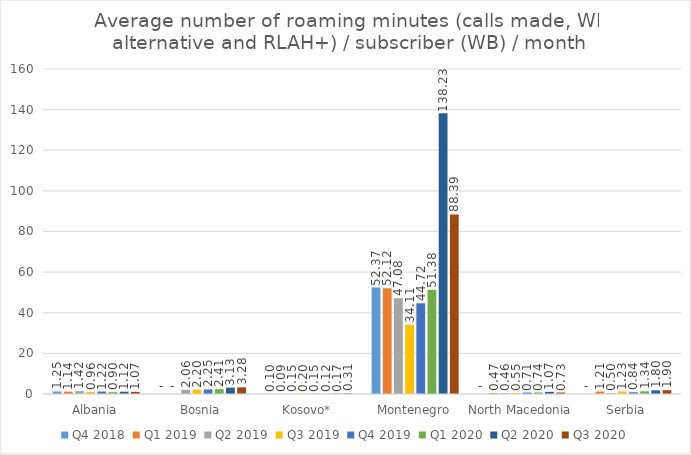
| Category | Q4 2018 | Q1 2019 | Q2 2019 | Q3 2019 | Q4 2019 | Q1 2020 | Q2 2020 | Q3 2020 |
|---|---|---|---|---|---|---|---|---|
| Albania | 1.247 | 1.14 | 1.416 | 0.965 | 1.224 | 0.903 | 1.121 | 1.068 |
| Bosnia | 0 | 0 | 2.059 | 2.197 | 2.25 | 2.407 | 3.128 | 3.278 |
| Kosovo* | 0.099 | 0.086 | 0.146 | 0.203 | 0.153 | 0.123 | 0.172 | 0.309 |
| Montenegro | 52.373 | 52.12 | 47.079 | 34.11 | 44.719 | 51.377 | 138.229 | 88.388 |
| North Macedonia | 0 | 0.47 | 0.464 | 0.547 | 0.705 | 0.737 | 1.066 | 0.733 |
| Serbia | 0 | 1.214 | 0.496 | 1.228 | 0.844 | 1.338 | 1.802 | 1.902 |